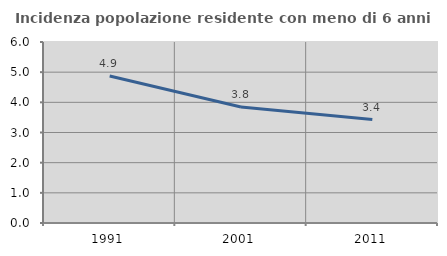
| Category | Incidenza popolazione residente con meno di 6 anni |
|---|---|
| 1991.0 | 4.871 |
| 2001.0 | 3.846 |
| 2011.0 | 3.43 |